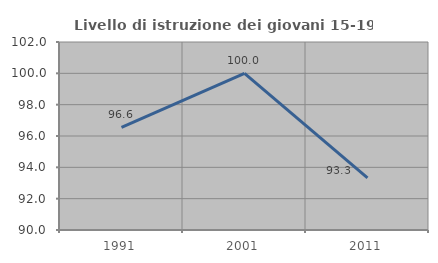
| Category | Livello di istruzione dei giovani 15-19 anni |
|---|---|
| 1991.0 | 96.552 |
| 2001.0 | 100 |
| 2011.0 | 93.333 |